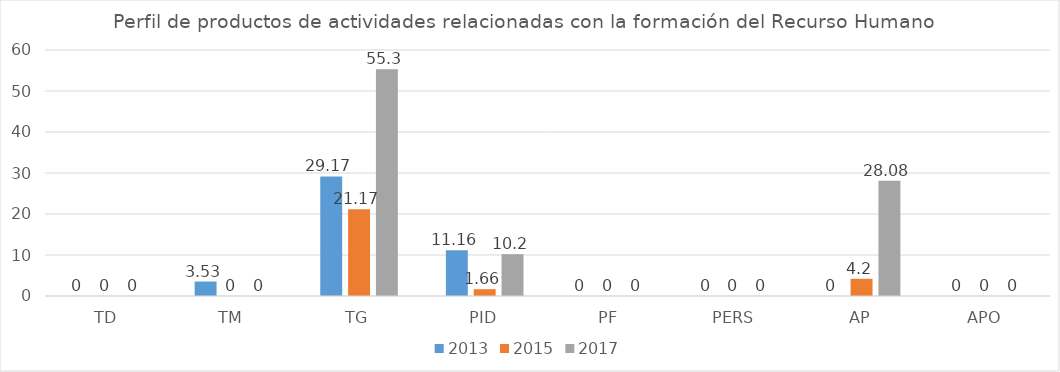
| Category | 2013 | 2015 | 2017 |
|---|---|---|---|
| TD | 0 | 0 | 0 |
| TM | 3.53 | 0 | 0 |
| TG | 29.17 | 21.17 | 55.3 |
| PID | 11.16 | 1.66 | 10.2 |
| PF | 0 | 0 | 0 |
| PERS | 0 | 0 | 0 |
| AP | 0 | 4.2 | 28.08 |
| APO | 0 | 0 | 0 |